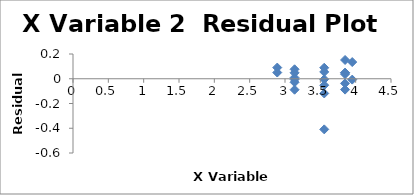
| Category | Series 0 |
|---|---|
| 2.8903717578961645 | 0.09 |
| 3.5553480614894135 | 0.089 |
| 3.9512437185814275 | 0.135 |
| 3.9512437185814275 | -0.007 |
| 2.8903717578961645 | 0.05 |
| 3.5553480614894135 | -0.004 |
| 3.5553480614894135 | -0.119 |
| 3.5553480614894135 | -0.409 |
| 3.1354942159291497 | -0.006 |
| 3.1354942159291497 | -0.089 |
| 3.8501476017100584 | 0.049 |
| 3.8501476017100584 | -0.037 |
| 3.8501476017100584 | -0.088 |
| 3.1354942159291497 | -0.028 |
| 3.1354942159291497 | 0.048 |
| 3.1354942159291497 | 0.076 |
| 3.1354942159291497 | 0.009 |
| 3.8501476017100584 | 0.048 |
| 3.8501476017100584 | 0.037 |
| 3.8501476017100584 | 0.152 |
| 3.5553480614894135 | 0.055 |
| 3.5553480614894135 | -0.052 |